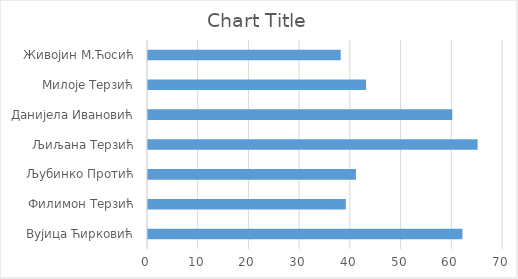
| Category | Series 0 |
|---|---|
| Вујица Ћирковић | 62 |
| Филимон Терзић | 39 |
| Љубинко Протић | 41 |
| Љиљана Терзић | 65 |
| Данијела Ивановић | 60 |
| Милоје Терзић | 43 |
| Живојин М.Ћосић | 38 |